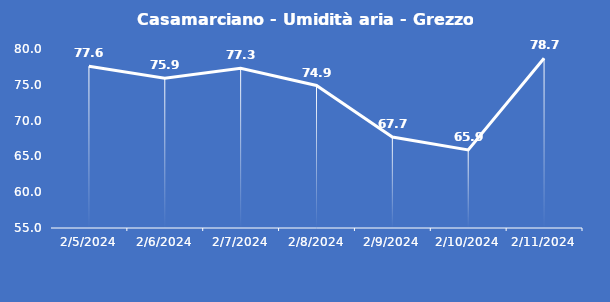
| Category | Casamarciano - Umidità aria - Grezzo (%) |
|---|---|
| 2/5/24 | 77.6 |
| 2/6/24 | 75.9 |
| 2/7/24 | 77.3 |
| 2/8/24 | 74.9 |
| 2/9/24 | 67.7 |
| 2/10/24 | 65.9 |
| 2/11/24 | 78.7 |